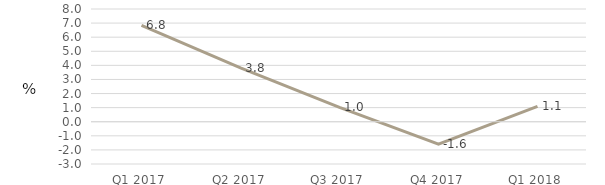
| Category | Households |
|---|---|
| Q1 2017 | 6.84 |
| Q2 2017 | 3.821 |
| Q3 2017 | 1.017 |
| Q4 2017 | -1.587 |
| Q1 2018 | 1.093 |